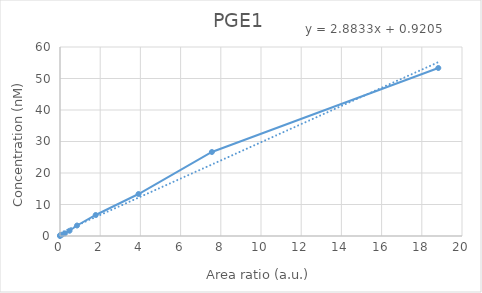
| Category | PGE1 |
|---|---|
| 0.0 | 0 |
| 0.000705422928396856 | 0.208 |
| 0.100539439750607 | 0.417 |
| 0.24362440209032 | 0.833 |
| 0.475183736742805 | 1.667 |
| 0.848030954509619 | 3.333 |
| 1.77631430550196 | 6.667 |
| 3.90737799786386 | 13.333 |
| 7.55705027930715 | 26.667 |
| 18.8213663577356 | 53.333 |